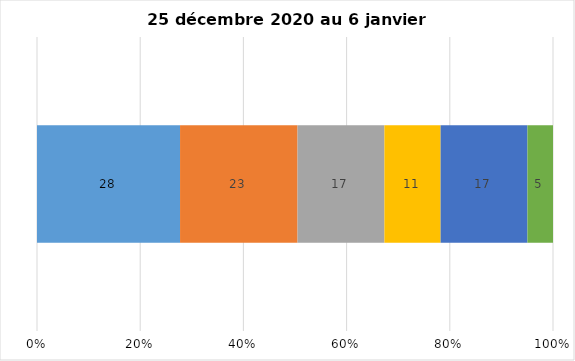
| Category | Plusieurs fois par jour | Une fois par jour | Quelques fois par semaine   | Une fois par semaine ou moins   |  Jamais   |  Je n’utilise pas les médias sociaux |
|---|---|---|---|---|---|---|
| 0 | 28 | 23 | 17 | 11 | 17 | 5 |